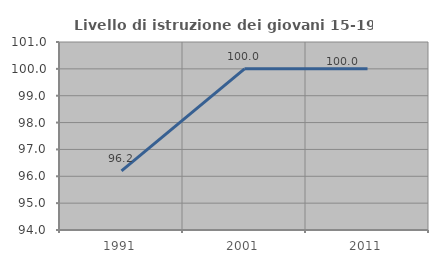
| Category | Livello di istruzione dei giovani 15-19 anni |
|---|---|
| 1991.0 | 96.203 |
| 2001.0 | 100 |
| 2011.0 | 100 |